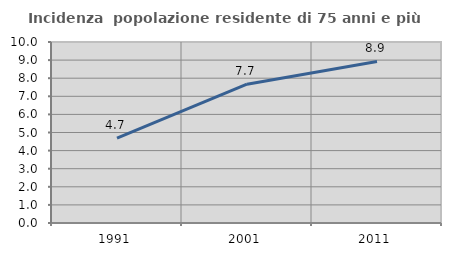
| Category | Incidenza  popolazione residente di 75 anni e più |
|---|---|
| 1991.0 | 4.693 |
| 2001.0 | 7.668 |
| 2011.0 | 8.928 |